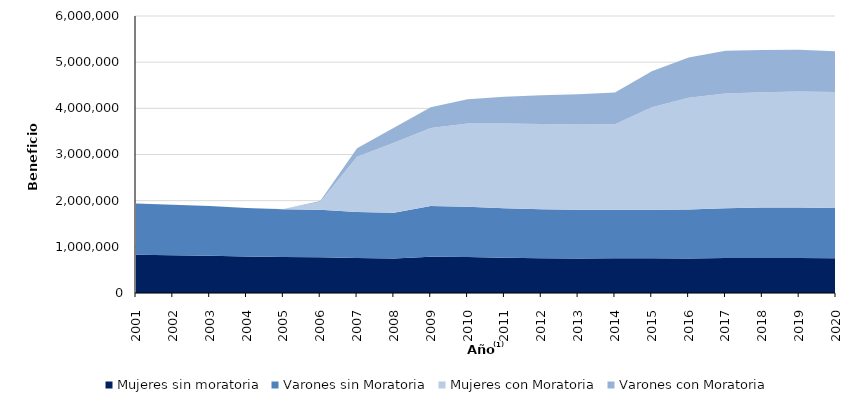
| Category | Mujeres sin moratoria | Varones sin Moratoria | Mujeres con Moratoria | Varones con Moratoria |
|---|---|---|---|---|
| 2001.0 | 828061.417 | 1109809.417 | 0 | 0 |
| 2002.0 | 815705 | 1093147.333 | 0 | 0 |
| 2003.0 | 804663.583 | 1078595.583 | 0 | 0 |
| 2004.0 | 788007.75 | 1053304.583 | 0 | 0 |
| 2005.0 | 779433.667 | 1034392.917 | 3657.75 | 1154.417 |
| 2006.0 | 775318.417 | 1030283.833 | 166012.083 | 23368.333 |
| 2007.0 | 757211.333 | 998161.75 | 1198543.083 | 179244.583 |
| 2008.0 | 746891.333 | 991910.833 | 1515689.25 | 323728.583 |
| 2009.0 | 786595.25 | 1097824 | 1690146.417 | 447493.25 |
| 2010.0 | 781154.75 | 1088186.917 | 1802257 | 522710 |
| 2011.0 | 765109.25 | 1071572.167 | 1837117.583 | 579071.167 |
| 2012.0 | 753775.333 | 1059202 | 1846787.583 | 622657.667 |
| 2013.0 | 749246.417 | 1051997.917 | 1848370.5 | 657183.083 |
| 2014.0 | 750328.833 | 1052843.25 | 1851739.917 | 687278.167 |
| 2015.0 | 750502.833 | 1052842.5 | 2221638.25 | 779133.333 |
| 2016.0 | 749809.333 | 1059012.333 | 2419816.833 | 873325.167 |
| 2017.0 | 756255.417 | 1078734 | 2484153.5 | 926038.667 |
| 2018.0 | 760053.5 | 1091974.583 | 2498008.5 | 915900.5 |
| 2019.0 | 755939.25 | 1093495.917 | 2514674.917 | 902724 |
| 2020.0 | 751774.167 | 1091409 | 2510353.5 | 884032.917 |